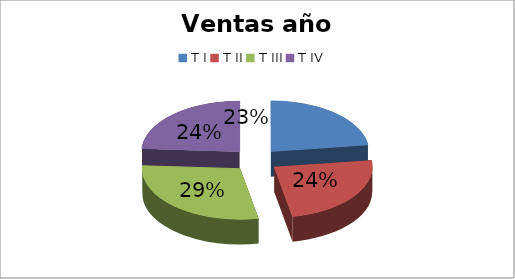
| Category | Series 0 |
|---|---|
| T I | 34616 |
| T II | 36470 |
| T III | 43717 |
| T IV | 36375 |